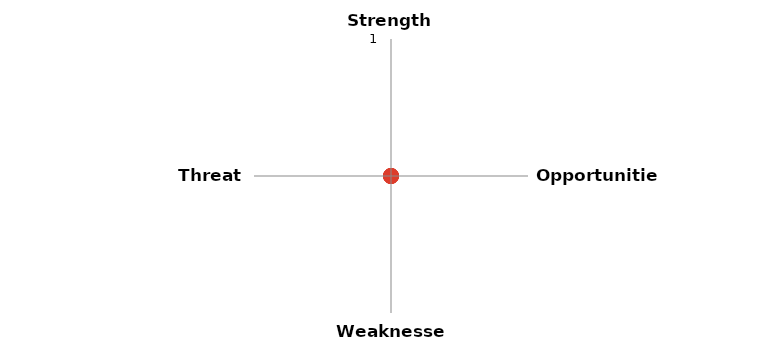
| Category | SWOT |
|---|---|
| Strengths | 0 |
| Opportunities | 0 |
| Weaknesses | 0 |
| Threats | 0 |